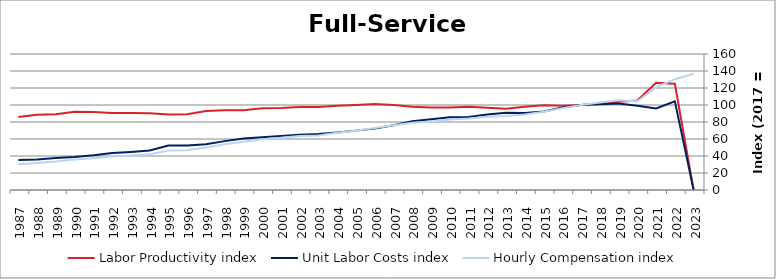
| Category | Labor Productivity index | Unit Labor Costs index | Hourly Compensation index |
|---|---|---|---|
| 2023.0 | 0 | 0 | 136.836 |
| 2022.0 | 124.916 | 104.369 | 130.374 |
| 2021.0 | 126.201 | 95.941 | 121.079 |
| 2020.0 | 105.349 | 98.991 | 104.286 |
| 2019.0 | 103.741 | 101.869 | 105.68 |
| 2018.0 | 102.029 | 101.013 | 103.063 |
| 2017.0 | 100 | 100 | 100 |
| 2016.0 | 99.216 | 97.08 | 96.319 |
| 2015.0 | 99.716 | 92.362 | 92.099 |
| 2014.0 | 97.966 | 90.673 | 88.829 |
| 2013.0 | 95.569 | 90.994 | 86.962 |
| 2012.0 | 96.789 | 88.926 | 86.071 |
| 2011.0 | 97.937 | 85.759 | 83.99 |
| 2010.0 | 96.954 | 85.495 | 82.891 |
| 2009.0 | 96.987 | 83.146 | 80.64 |
| 2008.0 | 97.844 | 80.803 | 79.061 |
| 2007.0 | 100.017 | 76.284 | 76.298 |
| 2006.0 | 101.077 | 72.195 | 72.972 |
| 2005.0 | 99.937 | 69.848 | 69.805 |
| 2004.0 | 99.205 | 67.768 | 67.23 |
| 2003.0 | 97.549 | 65.819 | 64.206 |
| 2002.0 | 97.564 | 65.147 | 63.561 |
| 2001.0 | 96.52 | 63.67 | 61.455 |
| 2000.0 | 96.076 | 62.125 | 59.687 |
| 1999.0 | 93.777 | 60.47 | 56.707 |
| 1998.0 | 93.768 | 57.493 | 53.91 |
| 1997.0 | 93.033 | 53.787 | 50.04 |
| 1996.0 | 89.117 | 52.43 | 46.724 |
| 1995.0 | 88.848 | 52.36 | 46.52 |
| 1994.0 | 90.26 | 46.442 | 41.919 |
| 1993.0 | 90.552 | 44.849 | 40.612 |
| 1992.0 | 90.652 | 43.601 | 39.525 |
| 1991.0 | 91.694 | 40.833 | 37.442 |
| 1990.0 | 91.93 | 38.955 | 35.811 |
| 1989.0 | 89.03 | 37.643 | 33.513 |
| 1988.0 | 88.601 | 35.932 | 31.836 |
| 1987.0 | 86.011 | 35.377 | 30.428 |